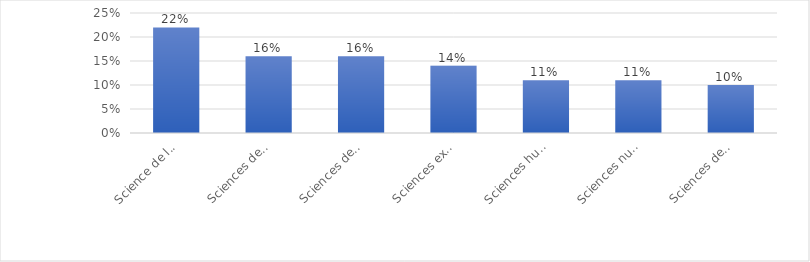
| Category | Series 0 |
|---|---|
| Science de l’environnement (agronomie, écologie, développement durable) | 0.22 |
| Sciences de la vie et de la santé | 0.16 |
| Sciences de la Terre et de l'Univers | 0.16 |
| Sciences exactes (maths, physique, chimie) | 0.14 |
| Sciences humaines et sociales | 0.11 |
| Sciences numériques | 0.11 |
| Sciences de l’ingénieur | 0.1 |